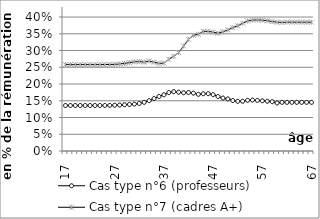
| Category | Cas type n°6 (professeurs) | Cas type n°7 (cadres A+) |
|---|---|---|
| 17.0 | 0.136 | 0.258 |
| 18.0 | 0.136 | 0.258 |
| 19.0 | 0.136 | 0.258 |
| 20.0 | 0.136 | 0.258 |
| 21.0 | 0.136 | 0.258 |
| 22.0 | 0.136 | 0.258 |
| 23.0 | 0.136 | 0.258 |
| 24.0 | 0.136 | 0.258 |
| 25.0 | 0.136 | 0.258 |
| 26.0 | 0.136 | 0.258 |
| 27.0 | 0.137 | 0.259 |
| 28.0 | 0.137 | 0.26 |
| 29.0 | 0.138 | 0.262 |
| 30.0 | 0.139 | 0.264 |
| 31.0 | 0.14 | 0.266 |
| 32.0 | 0.142 | 0.267 |
| 33.0 | 0.145 | 0.265 |
| 34.0 | 0.15 | 0.269 |
| 35.0 | 0.157 | 0.265 |
| 36.0 | 0.163 | 0.262 |
| 37.0 | 0.168 | 0.263 |
| 38.0 | 0.174 | 0.274 |
| 39.0 | 0.177 | 0.283 |
| 40.0 | 0.176 | 0.294 |
| 41.0 | 0.174 | 0.314 |
| 42.0 | 0.175 | 0.334 |
| 43.0 | 0.173 | 0.345 |
| 44.0 | 0.169 | 0.349 |
| 45.0 | 0.171 | 0.357 |
| 46.0 | 0.171 | 0.357 |
| 47.0 | 0.168 | 0.355 |
| 48.0 | 0.163 | 0.352 |
| 49.0 | 0.158 | 0.356 |
| 50.0 | 0.156 | 0.362 |
| 51.0 | 0.151 | 0.368 |
| 52.0 | 0.148 | 0.374 |
| 53.0 | 0.149 | 0.381 |
| 54.0 | 0.151 | 0.388 |
| 55.0 | 0.152 | 0.391 |
| 56.0 | 0.151 | 0.391 |
| 57.0 | 0.15 | 0.391 |
| 58.0 | 0.149 | 0.389 |
| 59.0 | 0.147 | 0.386 |
| 60.0 | 0.143 | 0.385 |
| 61.0 | 0.145 | 0.384 |
| 62.0 | 0.145 | 0.385 |
| 63.0 | 0.145 | 0.385 |
| 64.0 | 0.145 | 0.385 |
| 65.0 | 0.145 | 0.385 |
| 66.0 | 0.145 | 0.385 |
| 67.0 | 0.145 | 0.385 |